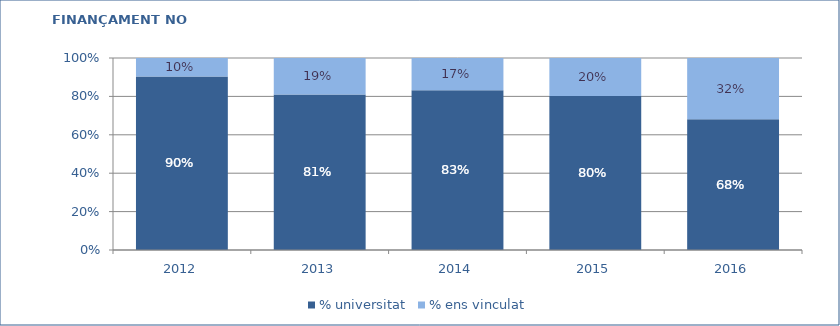
| Category | % universitat | % ens vinculat |
|---|---|---|
| 2012.0 | 0.903 | 0.097 |
| 2013.0 | 0.809 | 0.191 |
| 2014.0 | 0.832 | 0.168 |
| 2015.0 | 0.801 | 0.199 |
| 2016.0 | 0.681 | 0.319 |